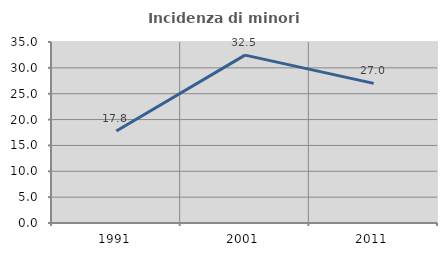
| Category | Incidenza di minori stranieri |
|---|---|
| 1991.0 | 17.778 |
| 2001.0 | 32.456 |
| 2011.0 | 27.001 |